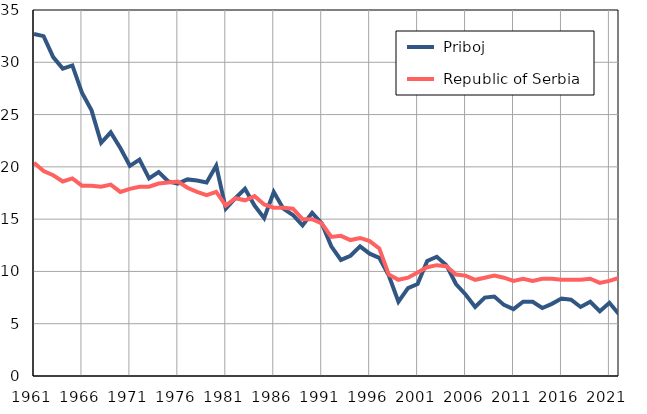
| Category |  Priboj |  Republic of Serbia |
|---|---|---|
| 1961.0 | 32.7 | 20.4 |
| 1962.0 | 32.5 | 19.6 |
| 1963.0 | 30.5 | 19.2 |
| 1964.0 | 29.4 | 18.6 |
| 1965.0 | 29.7 | 18.9 |
| 1966.0 | 27.1 | 18.2 |
| 1967.0 | 25.4 | 18.2 |
| 1968.0 | 22.3 | 18.1 |
| 1969.0 | 23.3 | 18.3 |
| 1970.0 | 21.8 | 17.6 |
| 1971.0 | 20.1 | 17.9 |
| 1972.0 | 20.7 | 18.1 |
| 1973.0 | 18.9 | 18.1 |
| 1974.0 | 19.5 | 18.4 |
| 1975.0 | 18.6 | 18.5 |
| 1976.0 | 18.4 | 18.6 |
| 1977.0 | 18.8 | 18 |
| 1978.0 | 18.7 | 17.6 |
| 1979.0 | 18.5 | 17.3 |
| 1980.0 | 20.1 | 17.6 |
| 1981.0 | 16 | 16.3 |
| 1982.0 | 17 | 17 |
| 1983.0 | 17.9 | 16.8 |
| 1984.0 | 16.3 | 17.2 |
| 1985.0 | 15.1 | 16.4 |
| 1986.0 | 17.6 | 16.1 |
| 1987.0 | 16 | 16.1 |
| 1988.0 | 15.4 | 16 |
| 1989.0 | 14.4 | 15 |
| 1990.0 | 15.6 | 15 |
| 1991.0 | 14.6 | 14.6 |
| 1992.0 | 12.4 | 13.3 |
| 1993.0 | 11.1 | 13.4 |
| 1994.0 | 11.5 | 13 |
| 1995.0 | 12.4 | 13.2 |
| 1996.0 | 11.7 | 12.9 |
| 1997.0 | 11.3 | 12.2 |
| 1998.0 | 9.6 | 9.7 |
| 1999.0 | 7.1 | 9.2 |
| 2000.0 | 8.4 | 9.4 |
| 2001.0 | 8.8 | 9.9 |
| 2002.0 | 11 | 10.4 |
| 2003.0 | 11.4 | 10.6 |
| 2004.0 | 10.6 | 10.5 |
| 2005.0 | 8.8 | 9.7 |
| 2006.0 | 7.8 | 9.6 |
| 2007.0 | 6.6 | 9.2 |
| 2008.0 | 7.5 | 9.4 |
| 2009.0 | 7.6 | 9.6 |
| 2010.0 | 6.8 | 9.4 |
| 2011.0 | 6.4 | 9.1 |
| 2012.0 | 7.1 | 9.3 |
| 2013.0 | 7.1 | 9.1 |
| 2014.0 | 6.5 | 9.3 |
| 2015.0 | 6.9 | 9.3 |
| 2016.0 | 7.4 | 9.2 |
| 2017.0 | 7.3 | 9.2 |
| 2018.0 | 6.6 | 9.2 |
| 2019.0 | 7.1 | 9.3 |
| 2020.0 | 6.2 | 8.9 |
| 2021.0 | 7 | 9.1 |
| 2022.0 | 5.9 | 9.4 |